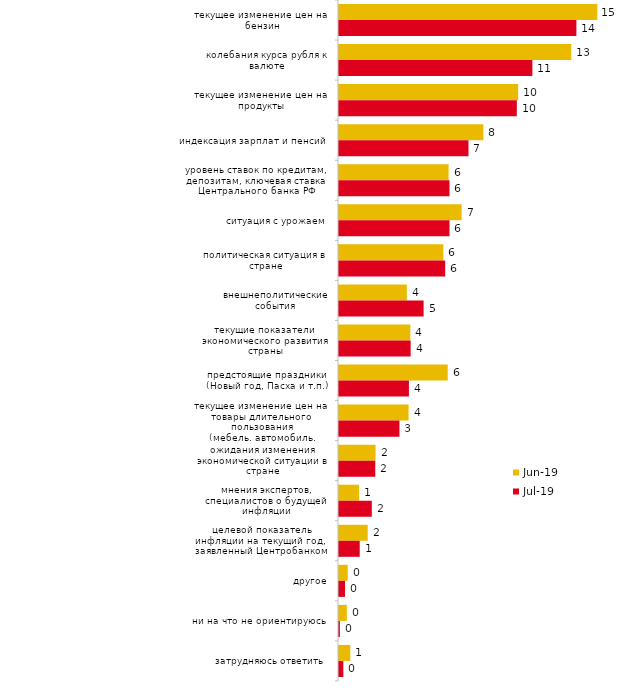
| Category | июн.19 | июл.19 |
|---|---|---|
| текущее изменение цен на бензин | 14.813 | 13.614 |
| колебания курса рубля к валюте | 13.317 | 11.089 |
| текущее изменение цен на продукты | 10.274 | 10.198 |
| индексация зарплат и пенсий | 8.279 | 7.426 |
| уровень ставок по кредитам, депозитам, ключевая ставка Центрального банка РФ | 6.284 | 6.337 |
| ситуация с урожаем | 7.032 | 6.337 |
| политическая ситуация в стране | 5.985 | 6.089 |
| внешнеполитические события | 3.89 | 4.851 |
| текущие показатели экономического развития страны | 4.09 | 4.109 |
| предстоящие праздники (Новый год, Пасха и т.п.) | 6.234 | 4.01 |
| текущее изменение цен на товары длительного пользования (мебель, автомобиль, бытовая техника и т.п.) | 3.99 | 3.465 |
| ожидания изменения экономической ситуации в стране | 2.095 | 2.079 |
| мнения экспертов, специалистов о будущей инфляции | 1.147 | 1.881 |
| целевой показатель инфляции на текущий год, заявленный Центробанком | 1.646 | 1.188 |
| другое | 0.499 | 0.347 |
| ни на что не ориентируюсь | 0.449 | 0.05 |
| затрудняюсь ответить | 0.648 | 0.248 |